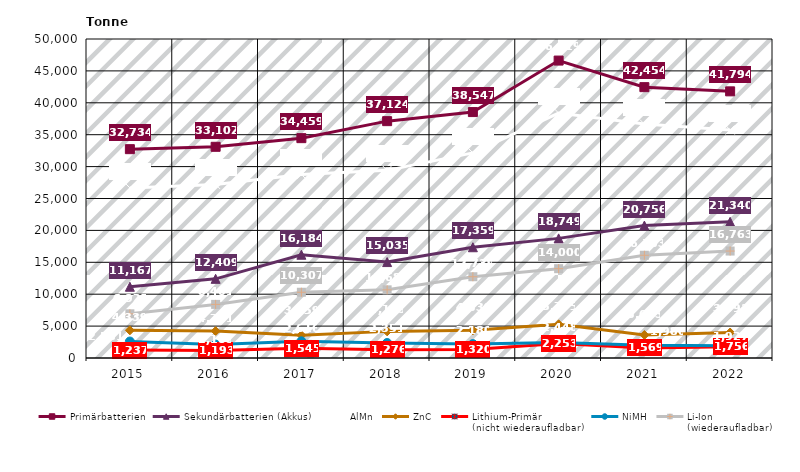
| Category | Primärbatterien | Sekundärbatterien (Akkus) | AlMn | ZnC | Lithium-Primär
(nicht wiederaufladbar) | NiMH | Li-Ion
(wiederaufladbar) |
|---|---|---|---|---|---|---|---|
| 2015.0 | 32734 | 11167 | 26662 | 4339 | 1237 | 2581 | 6927 |
| 2016.0 | 33102 | 12409 | 27195 | 4221 | 1193 | 2103 | 8401 |
| 2017.0 | 34459 | 16184 | 28773 | 3559 | 1545 | 2616 | 10307 |
| 2018.0 | 37124 | 15035 | 29411 | 4173 | 1276 | 2351 | 10684 |
| 2019.0 | 38547 | 17359 | 32146 | 4339 | 1320 | 2180 | 12739 |
| 2020.0 | 46619 | 18749 | 38390 | 5275 | 2253 | 2448 | 14000 |
| 2021.0 | 42454 | 20756 | 36665 | 3603 | 1569 | 1980 | 16103 |
| 2022.0 | 41794 | 21340 | 35744 | 3993 | 1756 | 1927 | 16763 |